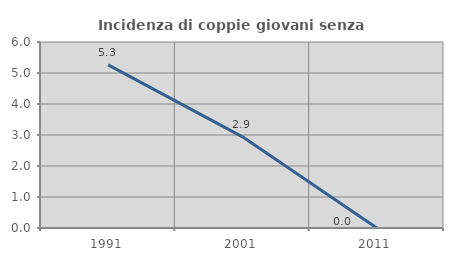
| Category | Incidenza di coppie giovani senza figli |
|---|---|
| 1991.0 | 5.263 |
| 2001.0 | 2.941 |
| 2011.0 | 0 |